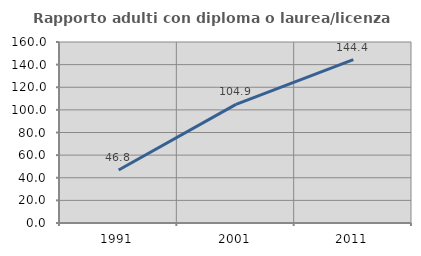
| Category | Rapporto adulti con diploma o laurea/licenza media  |
|---|---|
| 1991.0 | 46.809 |
| 2001.0 | 104.895 |
| 2011.0 | 144.444 |